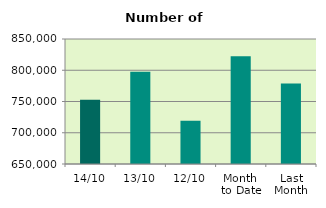
| Category | Series 0 |
|---|---|
| 14/10 | 752618 |
| 13/10 | 797784 |
| 12/10 | 719354 |
| Month 
to Date | 822441 |
| Last
Month | 778605.273 |